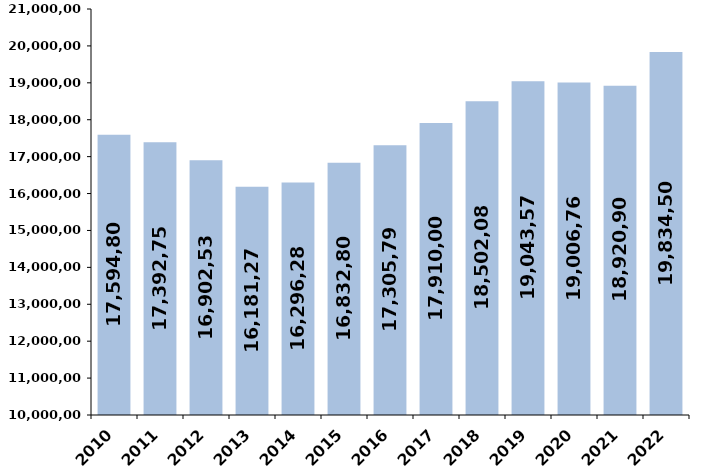
| Category | % de variación
 interanual |
|---|---|
| 2010 | 17594808.39 |
| 2011 | 17392754.21 |
| 2012 | 16902530.42 |
| 2013 | 16181274.84 |
| 2014 | 16296288.23 |
| 2015 | 16832800.5 |
| 2016 | 17305798.02 |
| 2017 | 17910006.63 |
| 2018 | 18502087.6 |
| 2019 | 19043576.33 |
| 2020 | 19006760 |
| 2021 | 18920902 |
| 2022 | 19834503.696 |